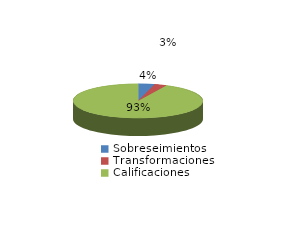
| Category | Series 0 |
|---|---|
| Sobreseimientos | 12 |
| Transformaciones | 9 |
| Calificaciones | 276 |